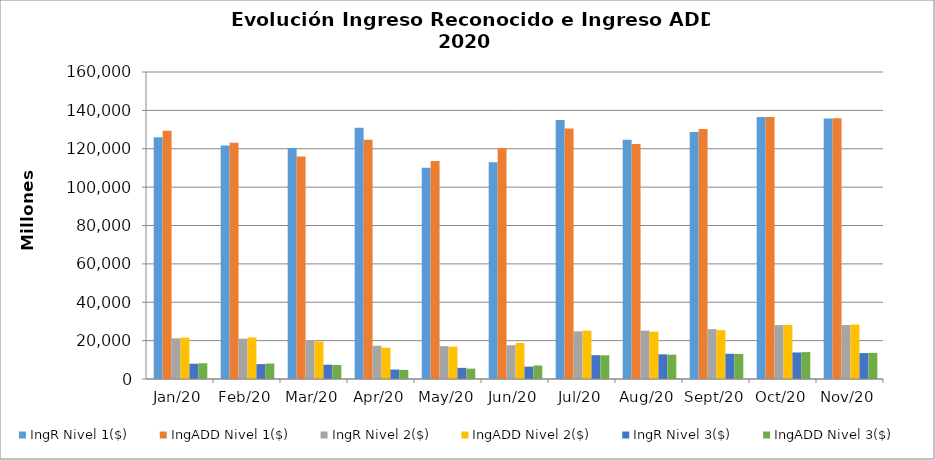
| Category | IngR Nivel 1($) | IngADD Nivel 1($) | IngR Nivel 2($) | IngADD Nivel 2($) | IngR Nivel 3($) | IngADD Nivel 3($) |
|---|---|---|---|---|---|---|
| 2020-01-01 | 126019835974 | 129357639375 | 21214662206 | 21565380911 | 7967237961 | 8199164916 |
| 2020-02-01 | 121643544198 | 123134878312 | 21011261864 | 21640106471 | 7750709832 | 8053837741 |
| 2020-03-01 | 120399173991 | 115940659317 | 20292600046 | 19532571352 | 7450125775 | 7286335766 |
| 2020-04-01 | 130974359350 | 124737460123 | 17317123352 | 16278735073 | 4950996139 | 4747729589 |
| 2020-05-01 | 110064257573 | 113580171072 | 17139563742 | 16840690505 | 5811882780 | 5404469221 |
| 2020-06-01 | 112963109953 | 120437816097 | 17612173457 | 18749316653 | 6448943037 | 7064401282 |
| 2020-07-01 | 135022826853 | 130514537862 | 24824843462 | 25172234437 | 12407250687 | 12356885072 |
| 2020-08-01 | 124650254416 | 122464973039 | 25201788672 | 24676210916 | 12850453733 | 12660996574 |
| 2020-09-01 | 128709062342 | 130332208447 | 25999363525 | 25469974973 | 13144152438 | 13065468290 |
| 2020-10-01 | 136524950329 | 136498146838 | 28061715183 | 28159739929 | 13824452471 | 14004372734 |
| 2020-11-01 | 135777529857 | 135864072651 | 28121073801 | 28362474743 | 13492642148 | 13627336253 |